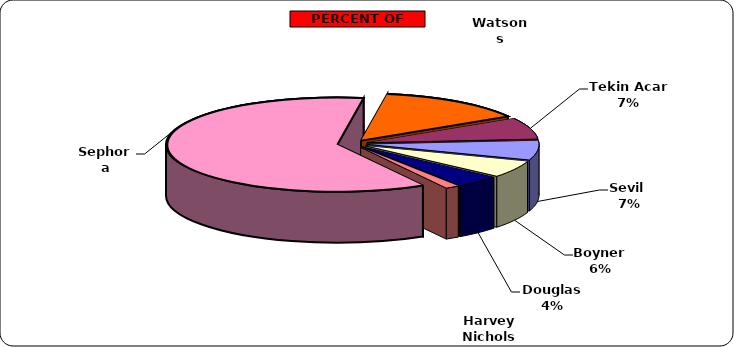
| Category | Series 0 |
|---|---|
| Sephora | 231 |
| Watsons | 53 |
| Tekin Acar  | 28 |
| Sevil  | 25 |
| Boyner | 22 |
| Douglas  | 16 |
| Harvey Nichols | 5 |